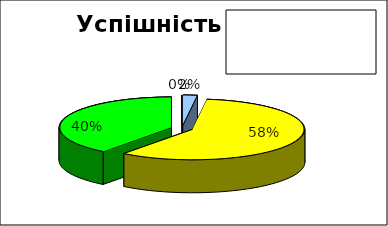
| Category | Series 0 |
|---|---|
| початковий | 0 |
| середній | 0.021 |
| достатній | 0.583 |
| високий | 0.396 |